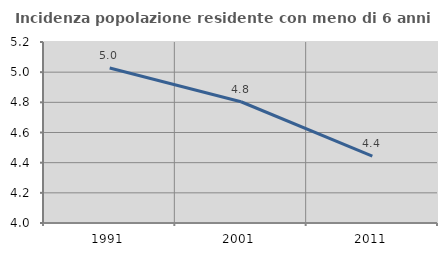
| Category | Incidenza popolazione residente con meno di 6 anni |
|---|---|
| 1991.0 | 5.028 |
| 2001.0 | 4.804 |
| 2011.0 | 4.444 |